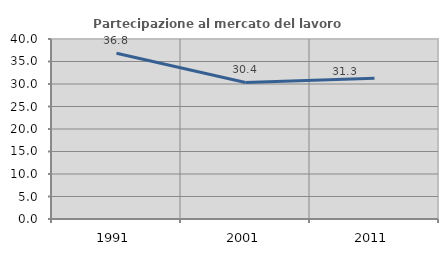
| Category | Partecipazione al mercato del lavoro  femminile |
|---|---|
| 1991.0 | 36.837 |
| 2001.0 | 30.352 |
| 2011.0 | 31.292 |